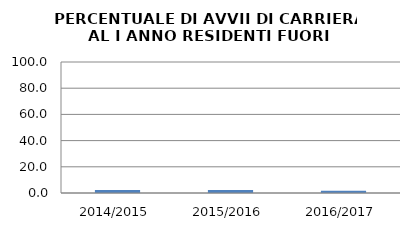
| Category | 2014/2015 2015/2016 2016/2017 |
|---|---|
| 2014/2015 | 2.242 |
| 2015/2016 | 2.273 |
| 2016/2017 | 1.633 |